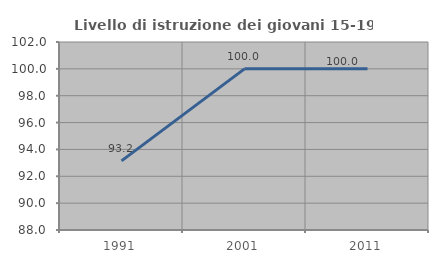
| Category | Livello di istruzione dei giovani 15-19 anni |
|---|---|
| 1991.0 | 93.151 |
| 2001.0 | 100 |
| 2011.0 | 100 |